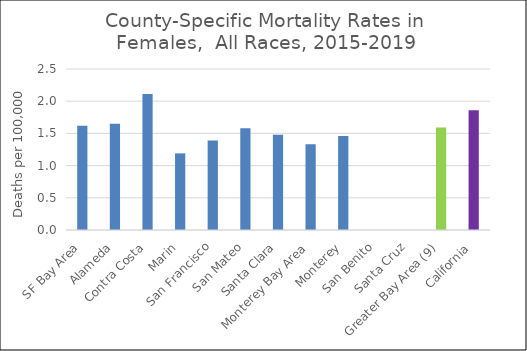
| Category | Female |
|---|---|
| SF Bay Area | 1.62 |
|   Alameda | 1.65 |
|   Contra Costa | 2.11 |
|   Marin | 1.19 |
|   San Francisco | 1.39 |
|   San Mateo | 1.58 |
|   Santa Clara | 1.48 |
| Monterey Bay Area | 1.33 |
|   Monterey | 1.46 |
|   San Benito | 0 |
|   Santa Cruz | 0 |
| Greater Bay Area (9) | 1.59 |
| California | 1.86 |